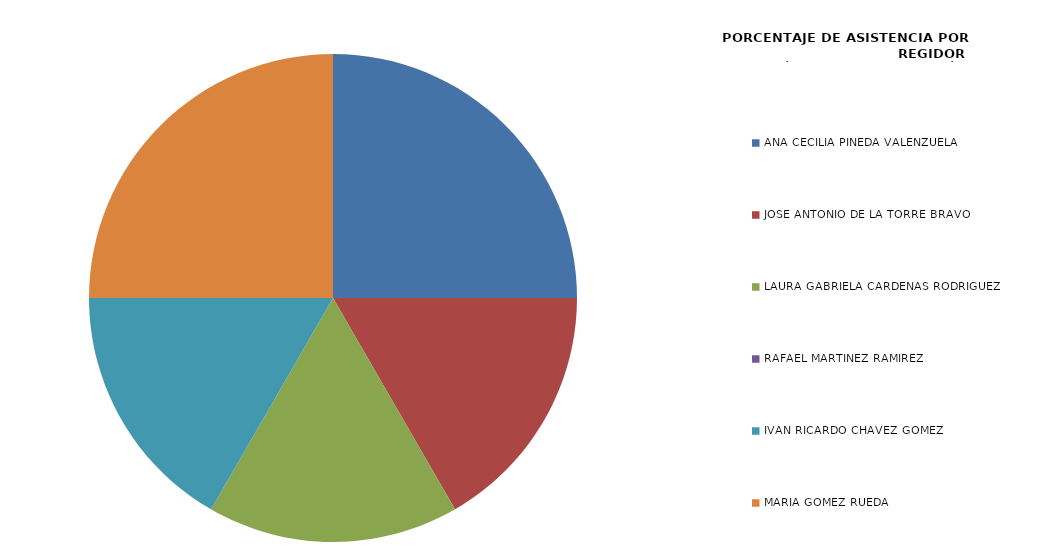
| Category | Series 0 |
|---|---|
| ANA CECILIA PINEDA VALENZUELA | 100 |
| JOSÉ ANTONIO DE LA TORRE BRAVO | 66.667 |
| LAURA GABRIELA CÁRDENAS RODRÍGUEZ | 66.667 |
| RAFAEL MARTÍNEZ RAMÍREZ | 0 |
| IVÁN RICARDO CHÁVEZ GÓMEZ | 66.667 |
| MARÍA GÓMEZ RUEDA | 100 |